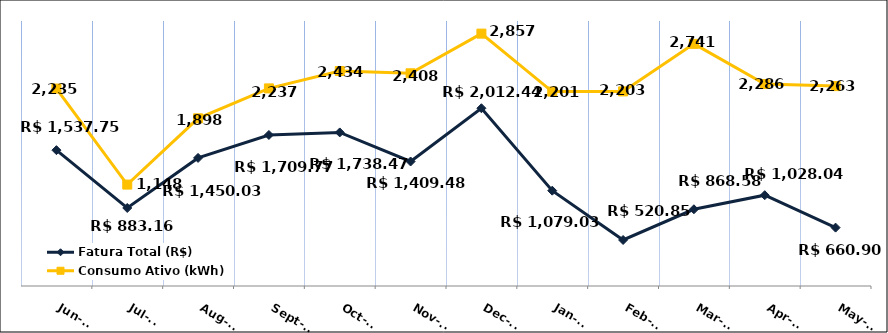
| Category | Fatura Total (R$) |
|---|---|
| 2023-06-01 | 1537.75 |
| 2023-07-01 | 883.16 |
| 2023-08-01 | 1450.03 |
| 2023-09-01 | 1709.77 |
| 2023-10-01 | 1738.47 |
| 2023-11-01 | 1409.48 |
| 2023-12-01 | 2012.44 |
| 2024-01-01 | 1079.03 |
| 2024-02-01 | 520.85 |
| 2024-03-01 | 868.58 |
| 2024-04-01 | 1028.04 |
| 2024-05-01 | 660.9 |